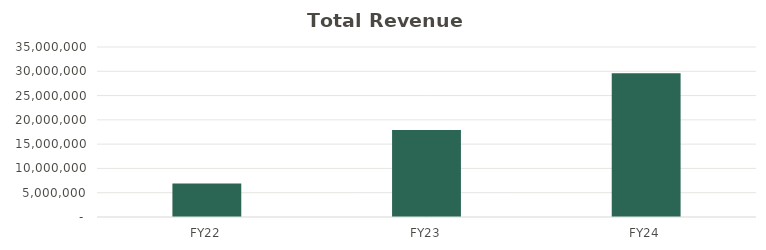
| Category | Series 0 |
|---|---|
| FY22 | 6903750 |
| FY23 | 17886630.856 |
| FY24 | 29599935.107 |